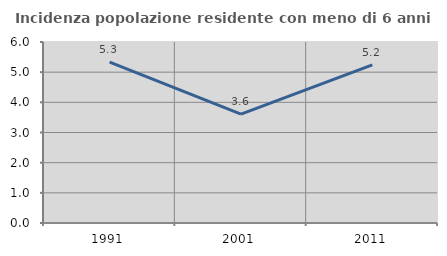
| Category | Incidenza popolazione residente con meno di 6 anni |
|---|---|
| 1991.0 | 5.336 |
| 2001.0 | 3.61 |
| 2011.0 | 5.245 |